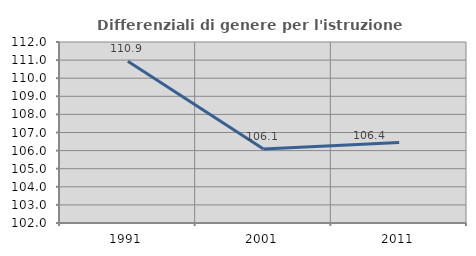
| Category | Differenziali di genere per l'istruzione superiore |
|---|---|
| 1991.0 | 110.931 |
| 2001.0 | 106.084 |
| 2011.0 | 106.443 |